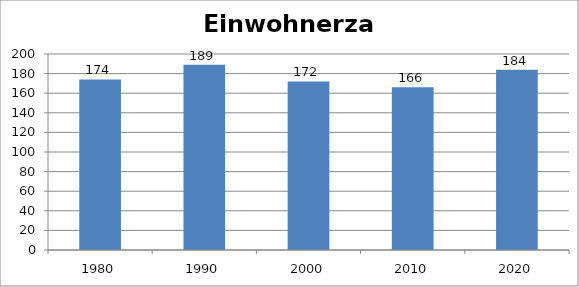
| Category | Einwohnerzahl |
|---|---|
| 1980.0 | 174 |
| 1990.0 | 189 |
| 2000.0 | 172 |
| 2010.0 | 166 |
| 2020.0 | 184 |